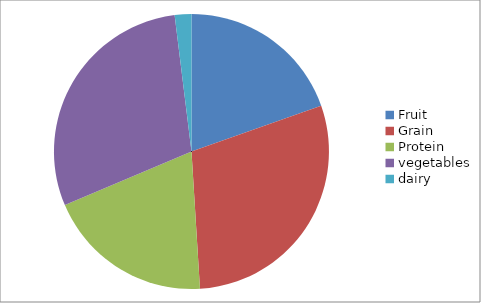
| Category | Series 0 |
|---|---|
| Fruit | 20 |
| Grain | 30 |
| Protein | 20 |
| vegetables | 30 |
| dairy | 2 |